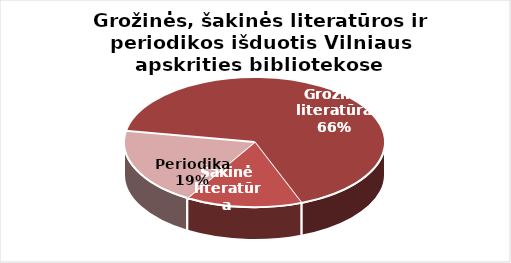
| Category | Series 0 |
|---|---|
| Grožinė literatūra | 1168274 |
| Šakinė literatūra | 254246 |
| Periodika | 337446 |